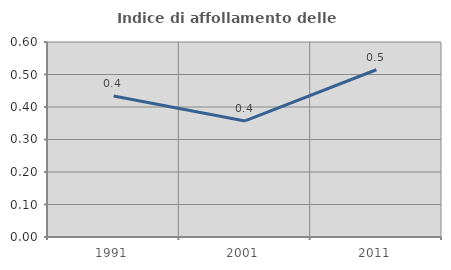
| Category | Indice di affollamento delle abitazioni  |
|---|---|
| 1991.0 | 0.434 |
| 2001.0 | 0.357 |
| 2011.0 | 0.515 |